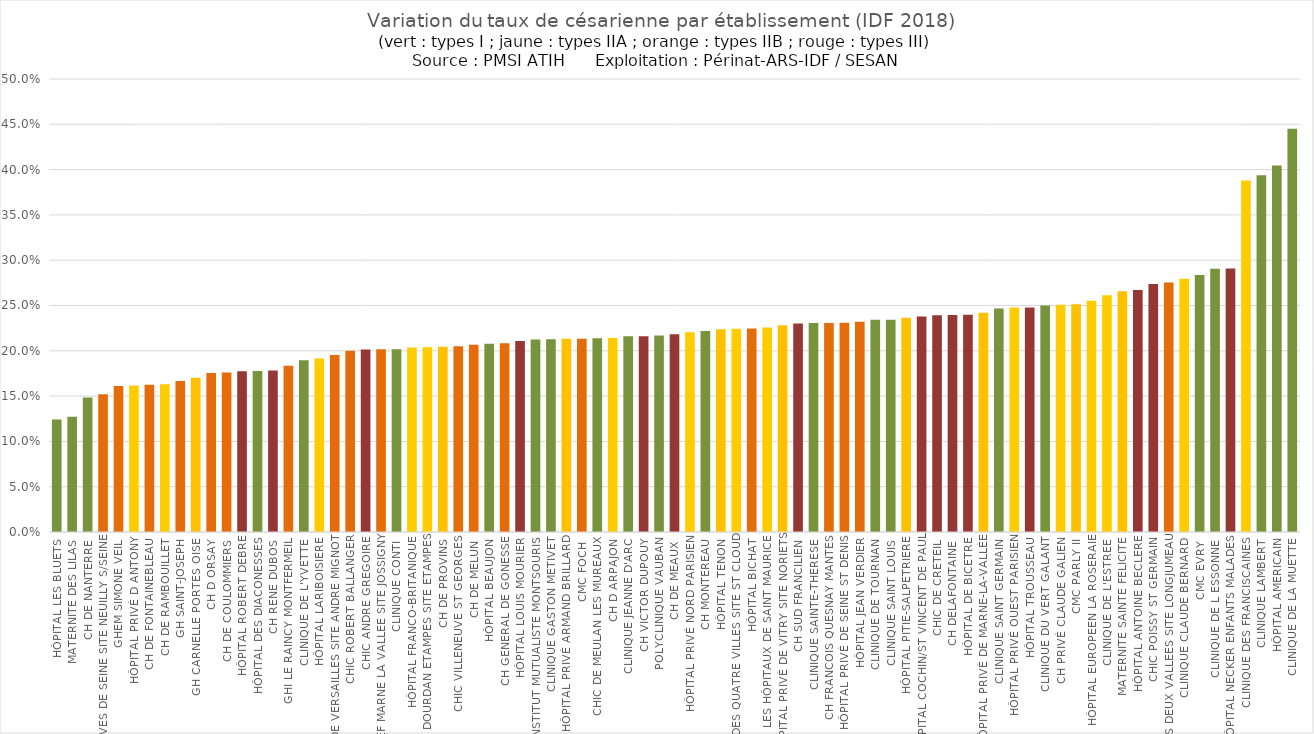
| Category | Series 0 |
|---|---|
| HÔPITAL LES BLUETS | 0.124 |
| MATERNITE DES LILAS | 0.127 |
| CH DE NANTERRE | 0.148 |
| CH RIVES DE SEINE SITE NEUILLY S/SEINE | 0.152 |
| GHEM SIMONE VEIL | 0.161 |
| HÔPITAL PRIVÉ D ANTONY | 0.162 |
| CH DE FONTAINEBLEAU | 0.162 |
| CH DE RAMBOUILLET | 0.163 |
| GH SAINT-JOSEPH | 0.167 |
| GH CARNELLE PORTES OISE  | 0.17 |
| CH D ORSAY | 0.175 |
| CH DE COULOMMIERS | 0.176 |
| HÔPITAL ROBERT DEBRE | 0.178 |
| HÔPITAL DES DIACONESSES | 0.178 |
| CH RENE DUBOS | 0.178 |
| GHI LE RAINCY MONTFERMEIL | 0.184 |
| CLINIQUE DE L'YVETTE | 0.19 |
| HÔPITAL LARIBOISIERE | 0.191 |
| CH DE VERSAILLES SITE ANDRE MIGNOT | 0.195 |
| CHIC ROBERT BALLANGER | 0.2 |
| CHIC ANDRE GREGOIRE | 0.201 |
| GHEF MARNE LA VALLEE SITE JOSSIGNY | 0.202 |
| CLINIQUE CONTI | 0.202 |
| HÔPITAL FRANCO-BRITANIQUE | 0.204 |
| CH DOURDAN ETAMPES SITE ETAMPES | 0.204 |
| CH DE PROVINS | 0.204 |
| CHIC VILLENEUVE ST GEORGES | 0.205 |
| CH DE MELUN | 0.207 |
| HÔPITAL BEAUJON | 0.208 |
| CH GENERAL DE GONESSE | 0.208 |
| HÔPITAL LOUIS MOURIER | 0.211 |
| INSTITUT MUTUALISTE MONTSOURIS | 0.213 |
| CLINIQUE GASTON METIVET | 0.213 |
| HÔPITAL PRIVÉ ARMAND BRILLARD | 0.213 |
| CMC FOCH | 0.213 |
| CHIC DE MEULAN LES MUREAUX | 0.214 |
| CH D ARPAJON | 0.214 |
| CLINIQUE JEANNE D'ARC | 0.216 |
| CH VICTOR DUPOUY | 0.216 |
| POLYCLINIQUE VAUBAN | 0.217 |
| CH DE MEAUX | 0.218 |
| HÔPITAL PRIVÉ NORD PARISIEN | 0.22 |
| CH MONTEREAU | 0.222 |
| HÔPITAL TENON | 0.224 |
| CH DES QUATRE VILLES SITE ST CLOUD | 0.224 |
| HÔPITAL BICHAT | 0.225 |
| LES HÔPITAUX DE SAINT MAURICE | 0.226 |
| HÔPITAL PRIVÉ DE VITRY SITE NORIETS | 0.228 |
| CH SUD FRANCILIEN | 0.23 |
| CLINIQUE SAINTE-THERESE | 0.231 |
| CH FRANCOIS QUESNAY MANTES | 0.231 |
| HÔPITAL PRIVÉ DE SEINE ST DENIS | 0.231 |
| HÔPITAL JEAN VERDIER | 0.232 |
| CLINIQUE DE TOURNAN | 0.234 |
| CLINIQUE SAINT LOUIS | 0.234 |
| HÔPITAL PITIE-SALPETRIERE | 0.237 |
| HÔPITAL COCHIN/ST VINCENT DE PAUL | 0.238 |
| CHIC DE CRETEIL | 0.239 |
| CH DELAFONTAINE | 0.239 |
| HÔPITAL DE BICETRE | 0.24 |
| HÔPITAL PRIVÉ DE MARNE-LA-VALLÉE | 0.242 |
| CLINIQUE SAINT GERMAIN | 0.247 |
| HÔPITAL PRIVÉ OUEST PARISIEN | 0.248 |
| HÔPITAL TROUSSEAU | 0.248 |
| CLINIQUE DU VERT GALANT | 0.25 |
| CH PRIVÉ CLAUDE GALIEN | 0.251 |
| CMC PARLY II | 0.251 |
| HÔPITAL EUROPEEN LA ROSERAIE | 0.255 |
| CLINIQUE DE L'ESTREE | 0.261 |
| MATERNITE SAINTE FELICITE | 0.266 |
| HÔPITAL ANTOINE BECLERE | 0.267 |
| CHIC POISSY ST GERMAIN | 0.274 |
| CH DES DEUX VALLEES SITE LONGJUMEAU | 0.275 |
| CLINIQUE CLAUDE BERNARD | 0.279 |
| CMC EVRY | 0.284 |
| CLINIQUE DE L ESSONNE | 0.291 |
| HÔPITAL NECKER ENFANTS MALADES | 0.291 |
| CLINIQUE DES FRANCISCAINES | 0.388 |
| CLINIQUE LAMBERT | 0.394 |
| HÔPITAL AMERICAIN | 0.405 |
| CLINIQUE DE LA MUETTE | 0.445 |